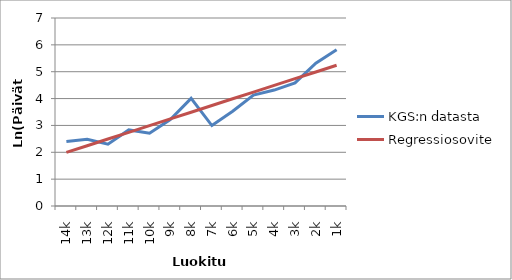
| Category | KGS:n datasta | Regressiosovite |
|---|---|---|
| 14k | 2.398 | 1.995 |
| 13k | 2.485 | 2.245 |
| 12k | 2.303 | 2.494 |
| 11k | 2.833 | 2.744 |
| 10k | 2.708 | 2.993 |
| 9k | 3.219 | 3.243 |
| 8k | 4.007 | 3.492 |
| 7k | 2.996 | 3.742 |
| 6k | 3.526 | 3.991 |
| 5k | 4.127 | 4.241 |
| 4k | 4.317 | 4.491 |
| 3k | 4.585 | 4.74 |
| 2k | 5.318 | 4.99 |
| 1k | 5.817 | 5.239 |